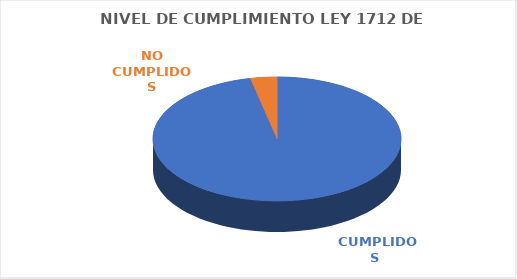
| Category | Series 0 |
|---|---|
|  CUMPLIDOS | 111 |
| NO CUMPLIDOS | 4 |